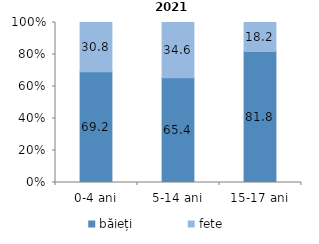
| Category | băieți | fete |
|---|---|---|
| 0-4 ani | 69.2 | 30.8 |
| 5-14 ani | 65.4 | 34.6 |
| 15-17 ani | 81.8 | 18.2 |